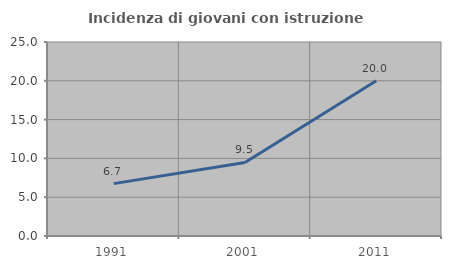
| Category | Incidenza di giovani con istruzione universitaria |
|---|---|
| 1991.0 | 6.747 |
| 2001.0 | 9.481 |
| 2011.0 | 20 |